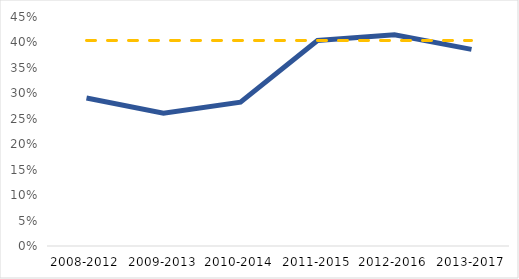
| Category | Series 0 | Series 1 |
|---|---|---|
| 2008-2012 | 0.291 | 0.404 |
| 2009-2013 | 0.261 | 0.404 |
| 2010-2014 | 0.283 | 0.404 |
| 2011-2015 | 0.404 | 0.404 |
| 2012-2016 | 0.415 | 0.404 |
| 2013-2017 | 0.386 | 0.404 |